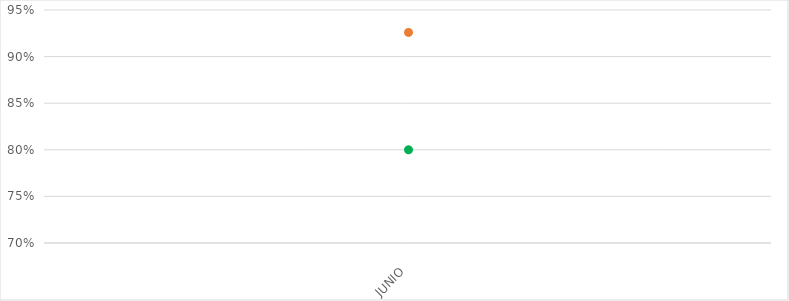
| Category | VALOR  | META PONDERADA |
|---|---|---|
| JUNIO | 0.926 | 0.8 |